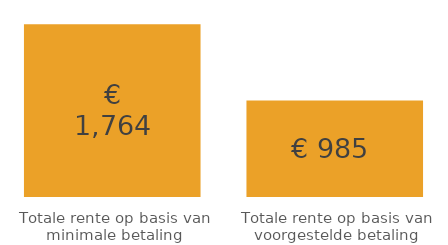
| Category | Series 0 |
|---|---|
| Totale rente op basis van minimale betaling | 1763.952 |
| Totale rente op basis van voorgestelde betaling | 984.811 |